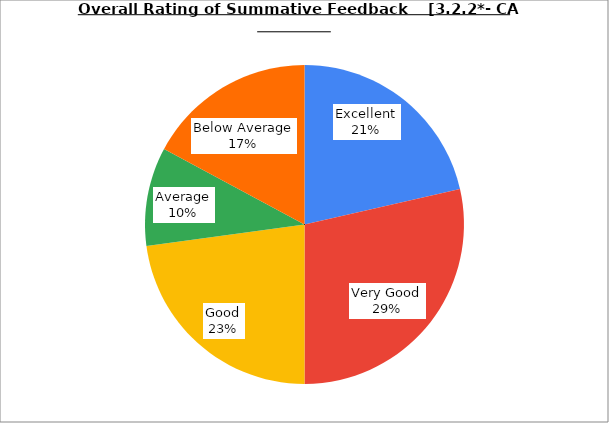
| Category | Series 0 |
|---|---|
| Excellent | 21.429 |
| Very Good | 28.571 |
| Good | 22.857 |
| Average | 10 |
| Below Average | 17.143 |